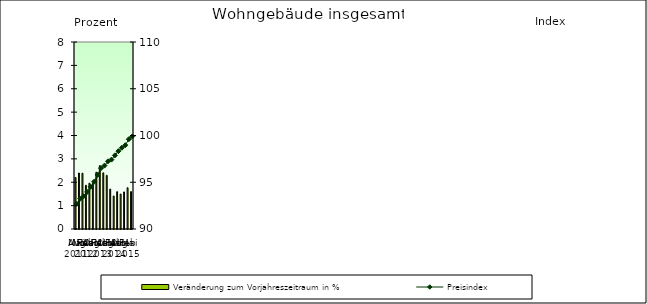
| Category | Veränderung zum Vorjahreszeitraum in % |
|---|---|
| 0 | 2.204 |
| 1 | 2.395 |
| 2 | 2.388 |
| 3 | 1.872 |
| 4 | 1.961 |
| 5 | 1.949 |
| 6 | 2.43 |
| 7 | 2.708 |
| 8 | 2.404 |
| 9 | 2.294 |
| 10 | 1.708 |
| 11 | 1.412 |
| 12 | 1.596 |
| 13 | 1.495 |
| 14 | 1.586 |
| 15 | 1.764 |
| 16 | 1.599 |